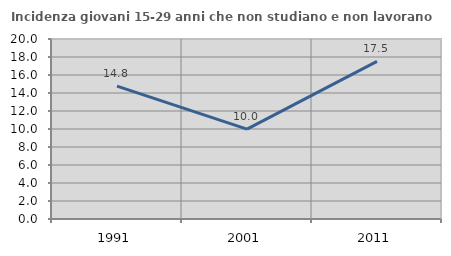
| Category | Incidenza giovani 15-29 anni che non studiano e non lavorano  |
|---|---|
| 1991.0 | 14.766 |
| 2001.0 | 9.991 |
| 2011.0 | 17.506 |